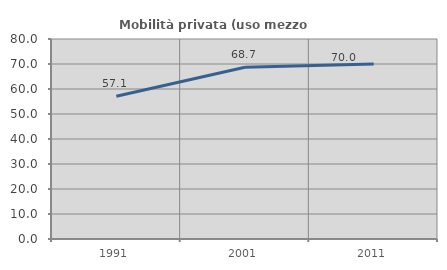
| Category | Mobilità privata (uso mezzo privato) |
|---|---|
| 1991.0 | 57.072 |
| 2001.0 | 68.671 |
| 2011.0 | 69.987 |